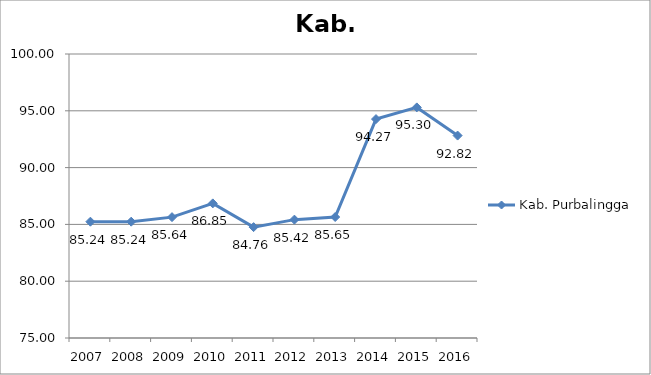
| Category | Kab. Purbalingga |
|---|---|
| 2007.0 | 85.24 |
| 2008.0 | 85.24 |
| 2009.0 | 85.64 |
| 2010.0 | 86.85 |
| 2011.0 | 84.76 |
| 2012.0 | 85.42 |
| 2013.0 | 85.65 |
| 2014.0 | 94.27 |
| 2015.0 | 95.3 |
| 2016.0 | 92.82 |